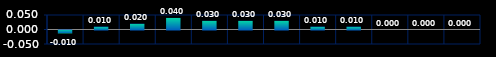
| Category | Series 0 |
|---|---|
| 0 | -0.01 |
| 1 | 0.01 |
| 2 | 0.02 |
| 3 | 0.04 |
| 4 | 0.03 |
| 5 | 0.03 |
| 6 | 0.03 |
| 7 | 0.01 |
| 8 | 0.01 |
| 9 | 0 |
| 10 | 0 |
| 11 | 0 |